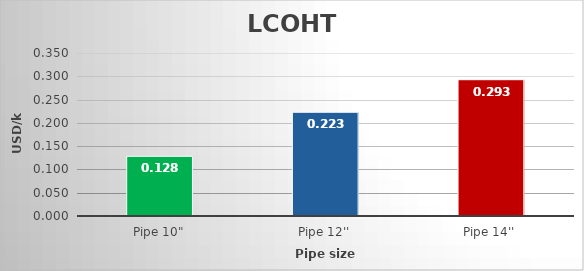
| Category | LCOHT [USD/kg] |
|---|---|
| Pipe 10" | 0.128 |
| Pipe 12'' | 0.223 |
| Pipe 14'' | 0.293 |